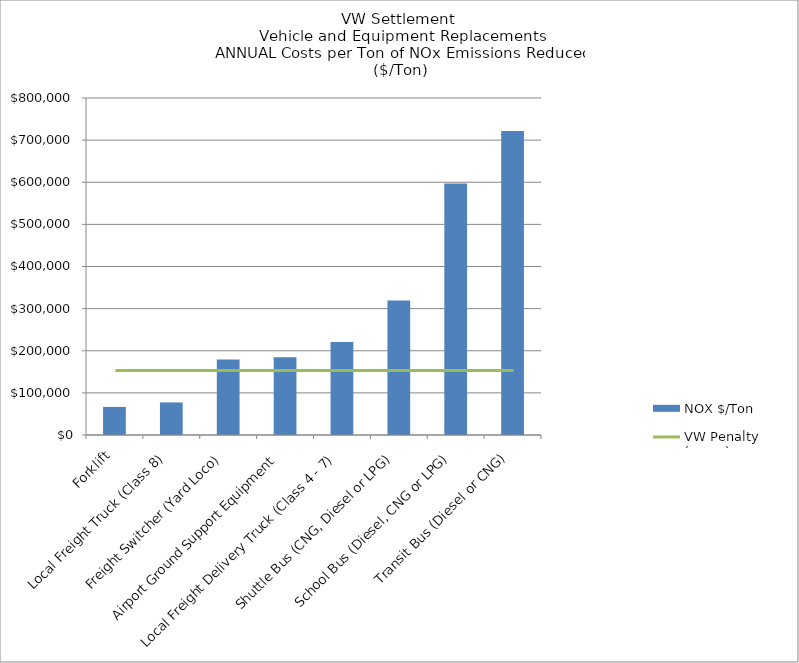
| Category | NOX $/Ton | Series 1 |
|---|---|---|
| Forklift | 66661.538 |  |
| Local Freight Truck (Class 8) | 77319.588 |  |
| Freight Switcher (Yard Loco) | 179257.362 |  |
| Airport Ground Support Equipment | 184831.53 |  |
| Local Freight Delivery Truck (Class 4 - 7) | 220699.268 |  |
| Shuttle Bus (CNG, Diesel or LPG) | 319210.678 |  |
| School Bus (Diesel, CNG or LPG) | 596931.66 |  |
| Transit Bus (Diesel or CNG) | 721763.109 |  |